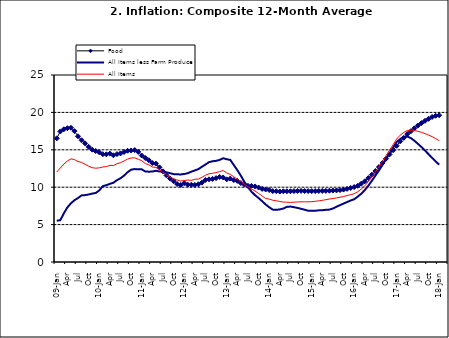
| Category | Food | All Items less Farm Produce | All Items |
|---|---|---|---|
| 09-Jan | 16.536 | 5.519 | 12.032 |
| Feb | 17.454 | 5.591 | 12.567 |
| Mar | 17.742 | 6.51 | 13.101 |
| Apr | 17.89 | 7.302 | 13.51 |
| May | 17.949 | 7.847 | 13.787 |
| June | 17.498 | 8.259 | 13.694 |
| Jul | 16.808 | 8.554 | 13.437 |
| Aug | 16.278 | 8.906 | 13.307 |
| Sep | 15.859 | 8.942 | 13.065 |
| Oct | 15.396 | 9.024 | 12.803 |
| Nov | 15.018 | 9.143 | 12.609 |
| Dec | 14.841 | 9.226 | 12.538 |
| 10-Jan | 14.668 | 9.567 | 12.586 |
| Feb | 14.411 | 10.138 | 12.7 |
| Mar | 14.395 | 10.269 | 12.757 |
| Apr | 14.489 | 10.444 | 12.915 |
| May | 14.266 | 10.597 | 12.893 |
| Jun | 14.424 | 10.948 | 13.132 |
| Jul | 14.514 | 11.193 | 13.284 |
| Aug | 14.706 | 11.549 | 13.5 |
| Sep | 14.872 | 11.997 | 13.764 |
| Oct | 14.906 | 12.345 | 13.908 |
| Nov | 14.967 | 12.423 | 13.928 |
| Dec | 14.723 | 12.383 | 13.74 |
| 11-Jan | 14.233 | 12.385 | 13.542 |
| Feb | 13.903 | 12.099 | 13.161 |
| Mar | 13.606 | 12.077 | 13.001 |
| Apr | 13.227 | 12.088 | 12.694 |
| May | 13.152 | 12.198 | 12.648 |
| Jun | 12.654 | 12.1 | 12.321 |
| Jul | 12.118 | 12.109 | 12.009 |
| Aug | 11.575 | 11.98 | 11.635 |
| Sep | 11.155 | 11.877 | 11.363 |
| Oct | 10.797 | 11.746 | 11.13 |
| Nov | 10.422 | 11.721 | 10.952 |
| Dec | 10.298 | 11.706 | 10.826 |
| 12-Jan | 10.538 | 11.765 | 10.886 |
| 12-Feb | 10.336 | 11.872 | 10.955 |
| 12-Mar | 10.325 | 12.075 | 10.914 |
| Apr | 10.304 | 12.242 | 11.054 |
| May | 10.387 | 12.419 | 11.096 |
| Jun | 10.617 | 12.732 | 11.32 |
| Jul | 10.963 | 13.032 | 11.599 |
| Aug | 11.056 | 13.349 | 11.791 |
| Sep | 11.104 | 13.467 | 11.859 |
| Oct | 11.216 | 13.525 | 11.948 |
| Nov | 11.372 | 13.649 | 12.091 |
| Dec | 11.296 | 13.873 | 12.224 |
| 13-Jan | 11.055 | 13.737 | 11.908 |
| Feb | 11.153 | 13.657 | 11.703 |
| Mar | 10.951 | 12.963 | 11.394 |
| Apr | 10.844 | 12.281 | 11.072 |
| May | 10.548 | 11.531 | 10.761 |
| Jun | 10.352 | 10.704 | 10.383 |
| Jul | 10.186 | 10.005 | 10.047 |
| Aug | 10.168 | 9.4 | 9.761 |
| Sep | 10.105 | 8.939 | 9.486 |
| Oct | 9.955 | 8.553 | 9.167 |
| Nov | 9.774 | 8.136 | 8.815 |
| Dec | 9.695 | 7.691 | 8.496 |
| 14-Jan | 9.626 | 7.317 | 8.408 |
| Feb | 9.484 | 7.005 | 8.257 |
| Mar | 9.464 | 6.976 | 8.19 |
| Apr | 9.416 | 7.03 | 8.092 |
| May | 9.448 | 7.151 | 8.012 |
| Jun | 9.464 | 7.369 | 7.998 |
| Jul | 9.459 | 7.411 | 7.968 |
| Aug | 9.481 | 7.325 | 7.996 |
| Sep | 9.501 | 7.228 | 8.027 |
| Oct | 9.508 | 7.116 | 8.047 |
| Nov | 9.492 | 6.991 | 8.046 |
| Dec | 9.481 | 6.854 | 8.047 |
| 15-Jan | 9.475 | 6.865 | 8.063 |
| Feb | 9.486 | 6.852 | 8.117 |
| Mar | 9.495 | 6.905 | 8.176 |
| Apr | 9.501 | 6.922 | 8.243 |
| May | 9.51 | 6.975 | 8.331 |
| Jun | 9.535 | 7.006 | 8.417 |
| Jul | 9.552 | 7.154 | 8.497 |
| Aug | 9.571 | 7.384 | 8.566 |
| Sep | 9.614 | 7.605 | 8.658 |
| Oct | 9.68 | 7.812 | 8.76 |
| Nov | 9.778 | 8.016 | 8.879 |
| Dec | 9.898 | 8.222 | 9.009 |
| 16-Jan | 10.017 | 8.391 | 9.13 |
| Feb | 10.184 | 8.732 | 9.386 |
| Mar | 10.471 | 9.132 | 9.751 |
| Apr | 10.786 | 9.614 | 10.182 |
| May | 11.221 | 10.196 | 10.746 |
| Jun | 11.672 | 10.864 | 11.372 |
| Jul | 12.162 | 11.553 | 12.045 |
| Aug | 12.696 | 12.247 | 12.744 |
| Sep | 13.238 | 12.98 | 13.454 |
| Oct | 13.817 | 13.757 | 14.206 |
| Nov | 14.386 | 14.542 | 14.958 |
| Dec | 14.946 | 15.307 | 15.697 |
| 17-Jan | 15.536 | 16.042 | 16.441 |
| Feb | 16.127 | 16.436 | 16.958 |
| Mar | 16.598 | 16.682 | 17.315 |
| Apr | 17.106 | 16.772 | 17.591 |
| May | 17.477 | 16.567 | 17.628 |
| Jun | 17.868 | 16.219 | 17.578 |
| Jul | 18.247 | 15.798 | 17.475 |
| Aug | 18.569 | 15.372 | 17.331 |
| Sep | 18.876 | 14.903 | 17.17 |
| Oct | 19.14 | 14.415 | 16.968 |
| Nov | 19.392 | 13.93 | 16.76 |
| Dec | 19.546 | 13.458 | 16.502 |
| 18-Jan | 19.621 | 13.01 | 16.215 |